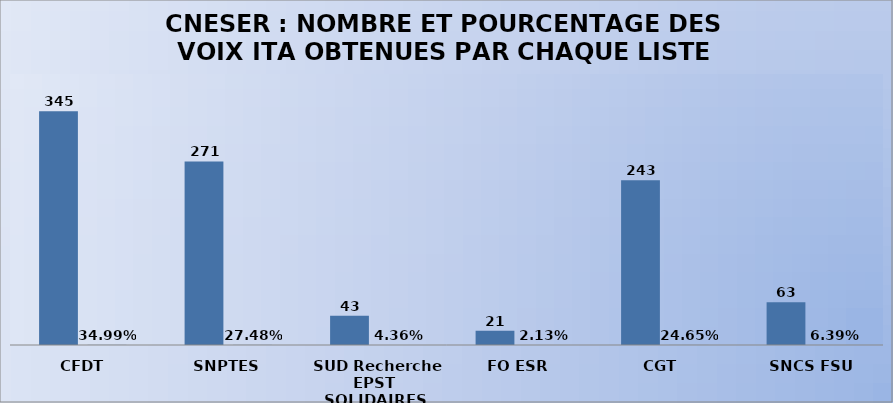
| Category | Series 0 | Series 1 |
|---|---|---|
|  CFDT | 345 | 0.35 |
| SNPTES | 271 | 0.275 |
|  SUD Recherche EPST SOLIDAIRES | 43 | 0.044 |
| FO ESR | 21 | 0.021 |
| CGT  | 243 | 0.246 |
|  SNCS FSU | 63 | 0.064 |